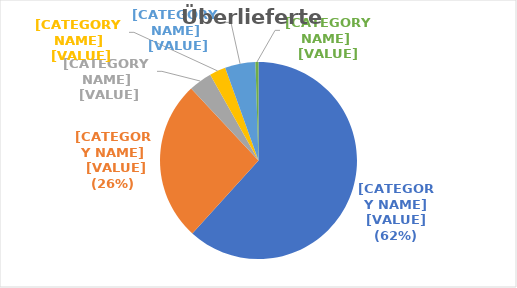
| Category | Series 0 |
|---|---|
| Sensenschmidt | 371 |
| Pfeyl | 158 |
| Pfister | 23 |
| Ayrer | 16 |
| Sporer | 30 |
| unbekannt | 3 |